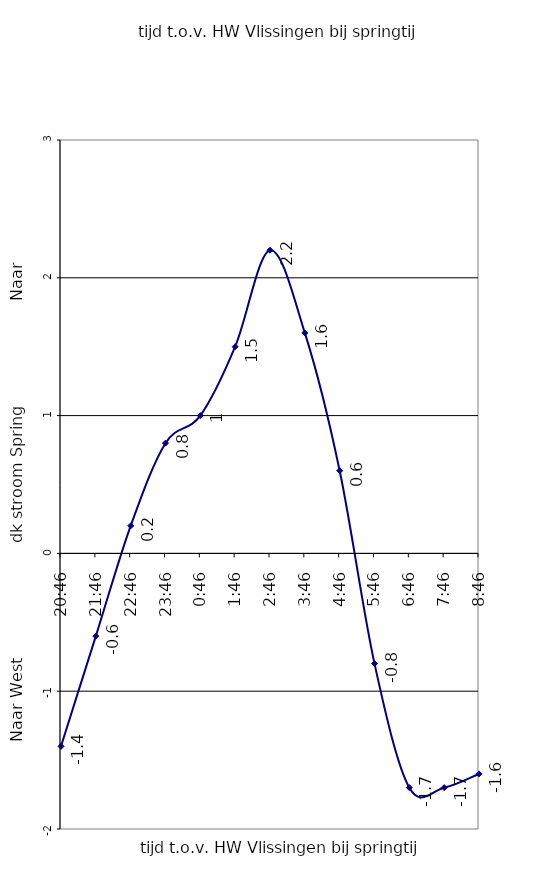
| Category | Series 0 |
|---|---|
| 1900-01-05 20:46:00 | -1.4 |
| 1900-01-04 21:46:00 | -0.6 |
| 1900-01-03 22:46:00 | 0.2 |
| 1900-01-02 23:46:00 | 0.8 |
| 1900-01-02 00:46:00 | 1 |
| 1900-01-01 01:46:00 | 1.5 |
| 0.11527777777777777 | 2.2 |
| 1900-01-01 03:46:00 | 1.6 |
| 1900-01-02 04:46:00 | 0.6 |
| 1900-01-03 05:46:00 | -0.8 |
| 1900-01-04 06:46:00 | -1.7 |
| 1900-01-05 07:46:00 | -1.7 |
| 1900-01-06 08:46:00 | -1.6 |